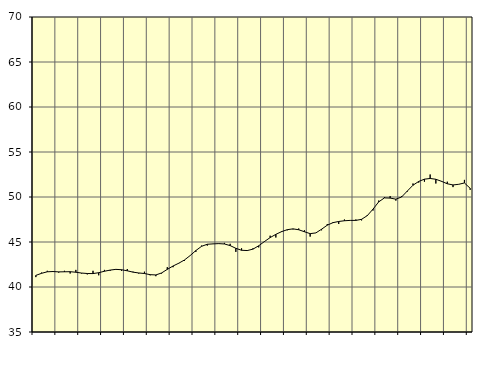
| Category | Piggar | Samtliga fast anställda (inkl. fast anställda utomlands) |
|---|---|---|
| nan | 41.1 | 41.29 |
| 1.0 | 41.6 | 41.52 |
| 1.0 | 41.8 | 41.69 |
| 1.0 | 41.7 | 41.72 |
| nan | 41.6 | 41.68 |
| 2.0 | 41.8 | 41.69 |
| 2.0 | 41.5 | 41.7 |
| 2.0 | 41.9 | 41.64 |
| nan | 41.5 | 41.55 |
| 3.0 | 41.4 | 41.5 |
| 3.0 | 41.8 | 41.49 |
| 3.0 | 41.3 | 41.59 |
| nan | 41.9 | 41.75 |
| 4.0 | 41.8 | 41.88 |
| 4.0 | 42 | 41.96 |
| 4.0 | 41.8 | 41.92 |
| nan | 42 | 41.8 |
| 5.0 | 41.7 | 41.65 |
| 5.0 | 41.5 | 41.56 |
| 5.0 | 41.7 | 41.5 |
| nan | 41.3 | 41.37 |
| 6.0 | 41.2 | 41.34 |
| 6.0 | 41.5 | 41.56 |
| 6.0 | 42.2 | 41.96 |
| nan | 42.2 | 42.33 |
| 7.0 | 42.6 | 42.64 |
| 7.0 | 42.9 | 43 |
| 7.0 | 43.5 | 43.49 |
| nan | 43.9 | 44.05 |
| 8.0 | 44.6 | 44.52 |
| 8.0 | 44.6 | 44.75 |
| 8.0 | 44.8 | 44.79 |
| nan | 44.8 | 44.82 |
| 9.0 | 44.9 | 44.78 |
| 9.0 | 44.8 | 44.6 |
| 9.0 | 43.9 | 44.3 |
| nan | 44.3 | 44.08 |
| 10.0 | 44.1 | 44.05 |
| 10.0 | 44.3 | 44.21 |
| 10.0 | 44.4 | 44.58 |
| nan | 45.1 | 45.05 |
| 11.0 | 45.7 | 45.49 |
| 11.0 | 45.5 | 45.85 |
| 11.0 | 46.2 | 46.15 |
| nan | 46.3 | 46.37 |
| 12.0 | 46.4 | 46.46 |
| 12.0 | 46.5 | 46.36 |
| 12.0 | 46.3 | 46.14 |
| nan | 45.6 | 45.93 |
| 13.0 | 46 | 46.01 |
| 13.0 | 46.3 | 46.42 |
| 13.0 | 47 | 46.87 |
| nan | 47.2 | 47.15 |
| 14.0 | 47 | 47.28 |
| 14.0 | 47.5 | 47.36 |
| 14.0 | 47.4 | 47.4 |
| nan | 47.5 | 47.4 |
| 15.0 | 47.4 | 47.52 |
| 15.0 | 48 | 47.93 |
| 15.0 | 48.5 | 48.65 |
| nan | 49.6 | 49.46 |
| 16.0 | 50 | 49.9 |
| 16.0 | 50.1 | 49.88 |
| 16.0 | 49.6 | 49.76 |
| nan | 50.1 | 50 |
| 17.0 | 50.6 | 50.66 |
| 17.0 | 51.5 | 51.31 |
| 17.0 | 51.6 | 51.73 |
| nan | 51.7 | 51.98 |
| 18.0 | 52.5 | 52.06 |
| 18.0 | 51.5 | 51.97 |
| 18.0 | 51.7 | 51.74 |
| nan | 51.7 | 51.47 |
| 19.0 | 51.1 | 51.34 |
| 19.0 | 51.4 | 51.41 |
| 19.0 | 51.9 | 51.56 |
| nan | 50.8 | 50.97 |